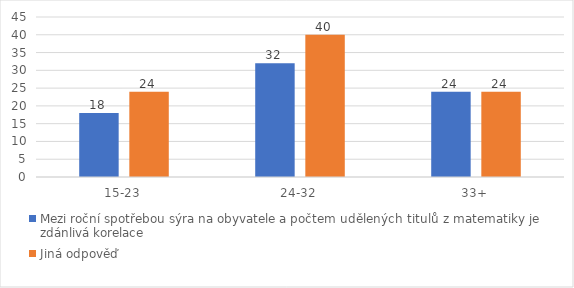
| Category | Mezi roční spotřebou sýra na obyvatele a počtem udělených titulů z matematiky je zdánlivá korelace | Jiná odpověď |
|---|---|---|
| 15-23 | 18 | 24 |
| 24-32 | 32 | 40 |
| 33+ | 24 | 24 |